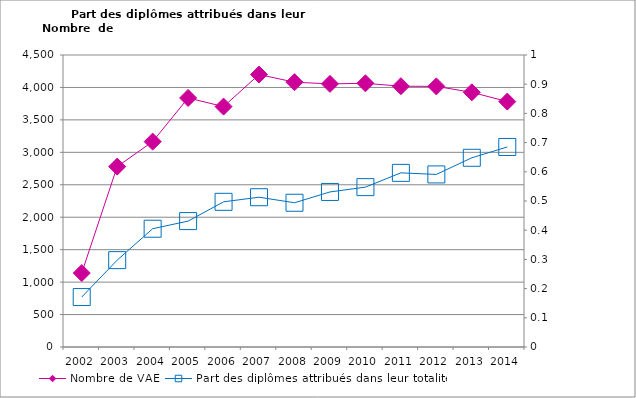
| Category | Nombre de VAE |
|---|---|
| 2002.0 | 1140 |
| 2003.0 | 2780 |
| 2004.0 | 3165 |
| 2005.0 | 3838 |
| 2006.0 | 3705 |
| 2007.0 | 4199 |
| 2008.0 | 4081 |
| 2009.0 | 4055 |
| 2010.0 | 4064 |
| 2011.0 | 4019 |
| 2012.0 | 4016 |
| 2013.0 | 3925 |
| 2014.0 | 3782 |